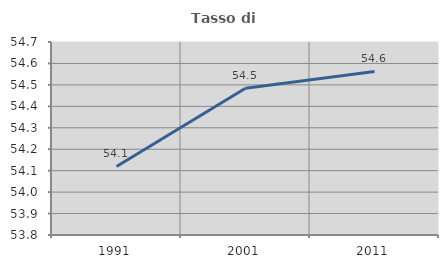
| Category | Tasso di occupazione   |
|---|---|
| 1991.0 | 54.119 |
| 2001.0 | 54.485 |
| 2011.0 | 54.563 |